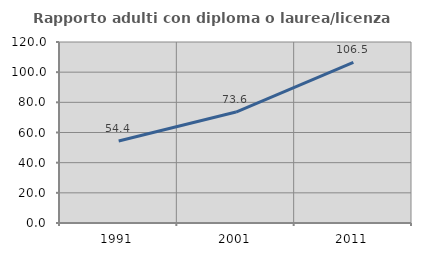
| Category | Rapporto adulti con diploma o laurea/licenza media  |
|---|---|
| 1991.0 | 54.356 |
| 2001.0 | 73.56 |
| 2011.0 | 106.527 |